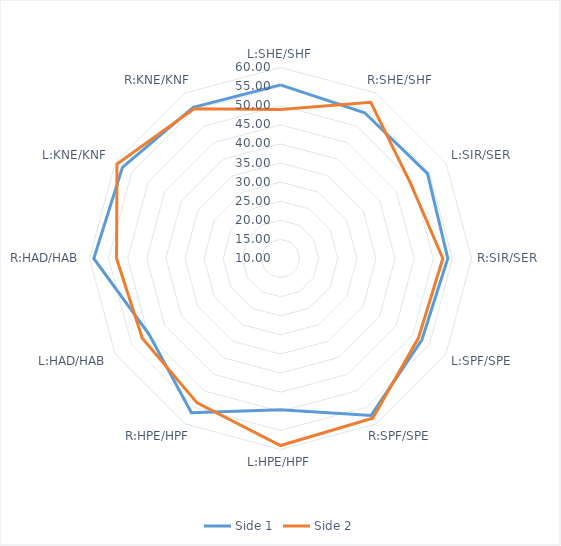
| Category | Side 1 | Side 2 |
|---|---|---|
| L:SHE/SHF | 55.46 | 49.02 |
| R:SHE/SHF | 54.07 | 57.24 |
| L:SIR/SER | 54.44 | 49.31 |
| R:SIR/SER | 53.8 | 52.5 |
| L:SPF/SPE | 52.71 | 51.68 |
| R:SPF/SPE | 57.44 | 58.27 |
| L:HPE/HPF | 49.61 | 58.96 |
| R:HPE/HPF | 56.64 | 53.65 |
| L:HAD/HAB | 49.74 | 51.77 |
| R:HAD/HAB | 58.88 | 52.92 |
| L:KNE/KNF | 57.77 | 59.42 |
| R:KNE/KNF | 55.7 | 55.27 |